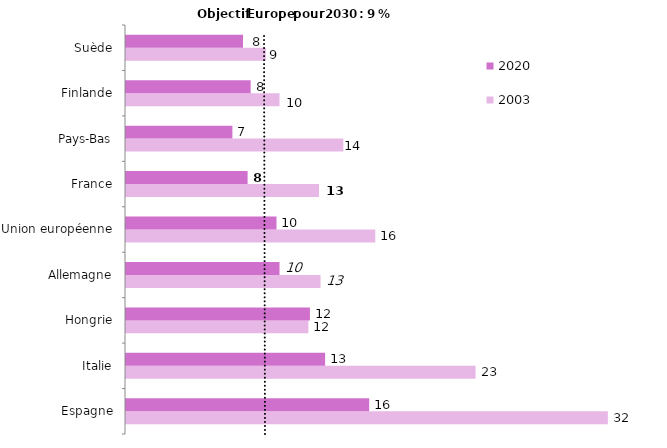
| Category | 2003 | 2020 |
|---|---|---|
| Espagne | 31.7 | 16 |
| Italie | 23 | 13.1 |
| Hongrie | 12 | 12.1 |
| Allemagne | 12.8 | 10.1 |
| Union européenne | 16.4 | 9.9 |
| France | 12.7 | 8 |
| Pays-Bas | 14.3 | 7 |
| Finlande | 10.1 | 8.2 |
| Suède | 9.2 | 7.7 |